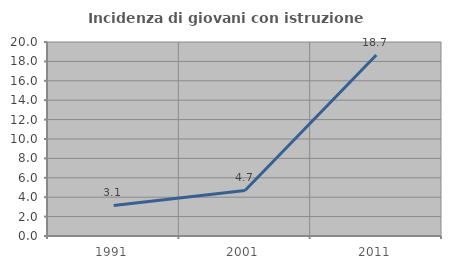
| Category | Incidenza di giovani con istruzione universitaria |
|---|---|
| 1991.0 | 3.145 |
| 2001.0 | 4.698 |
| 2011.0 | 18.667 |